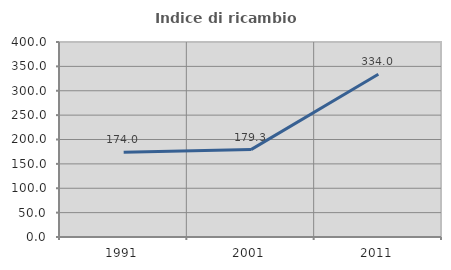
| Category | Indice di ricambio occupazionale  |
|---|---|
| 1991.0 | 174 |
| 2001.0 | 179.268 |
| 2011.0 | 333.962 |